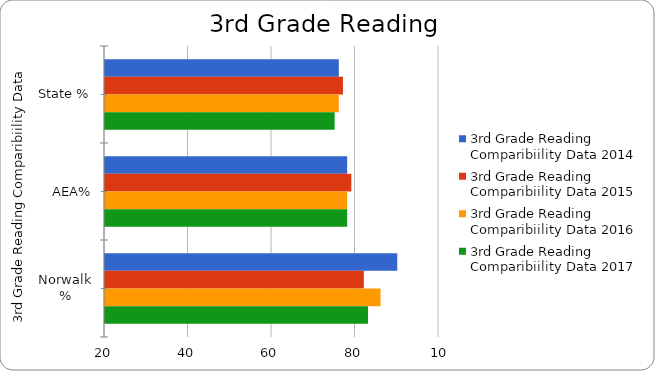
| Category | 3rd Grade Reading Comparibiility Data 2014 | 3rd Grade Reading Comparibiility Data 2015 | 3rd Grade Reading Comparibiility Data 2016 | 3rd Grade Reading Comparibiility Data 2017 |
|---|---|---|---|---|
| State % | 76 | 77 | 76 | 75 |
| AEA% | 78 | 79 | 78 | 78 |
| Norwalk % | 90 | 82 | 86 | 83 |